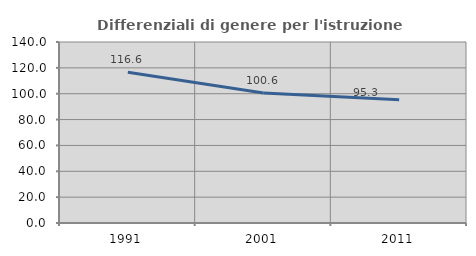
| Category | Differenziali di genere per l'istruzione superiore |
|---|---|
| 1991.0 | 116.585 |
| 2001.0 | 100.634 |
| 2011.0 | 95.344 |